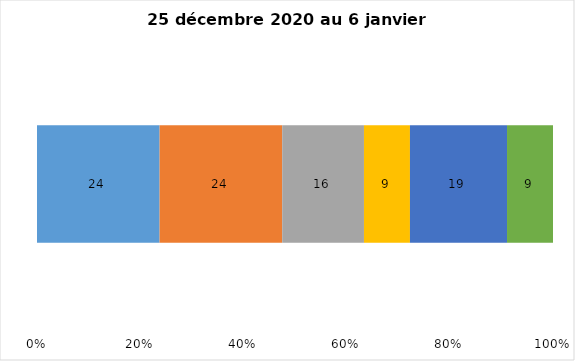
| Category | Plusieurs fois par jour | Une fois par jour | Quelques fois par semaine   | Une fois par semaine ou moins   |  Jamais   |  Je n’utilise pas les médias sociaux |
|---|---|---|---|---|---|---|
| 0 | 24 | 24 | 16 | 9 | 19 | 9 |